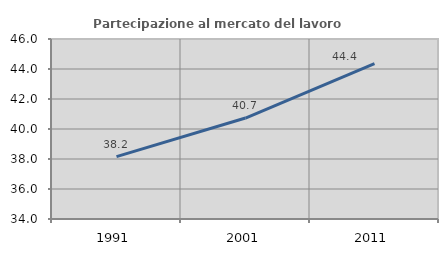
| Category | Partecipazione al mercato del lavoro  femminile |
|---|---|
| 1991.0 | 38.16 |
| 2001.0 | 40.73 |
| 2011.0 | 44.353 |